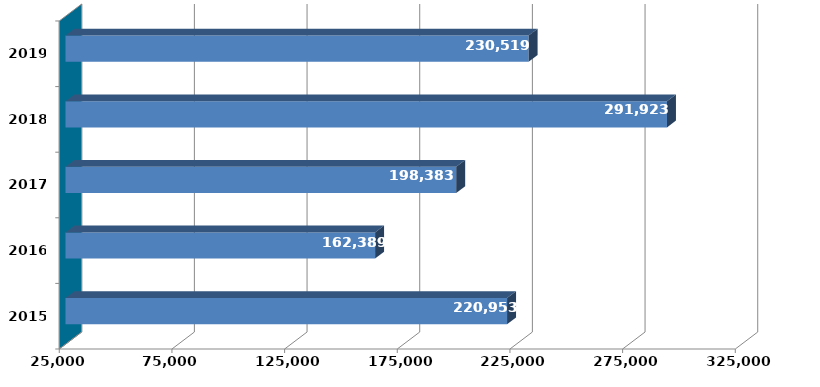
| Category |  Column2  |
|---|---|
| 2015.0 | 220952703 |
| 2016.0 | 162388931 |
| 2017.0 | 198382761 |
| 2018.0 | 291922985 |
| 2019.0 | 230519280 |